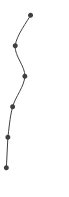
| Category | Series 0 |
|---|---|
| 0.40132554623275346 | 1 |
| 0.15013184065855983 | 2 |
| 0.3078831897595631 | 3 |
| 0.10704511091938536 | 4 |
| 0.029434460766735386 | 5 |
| 0.0041733510373479065 | 6 |